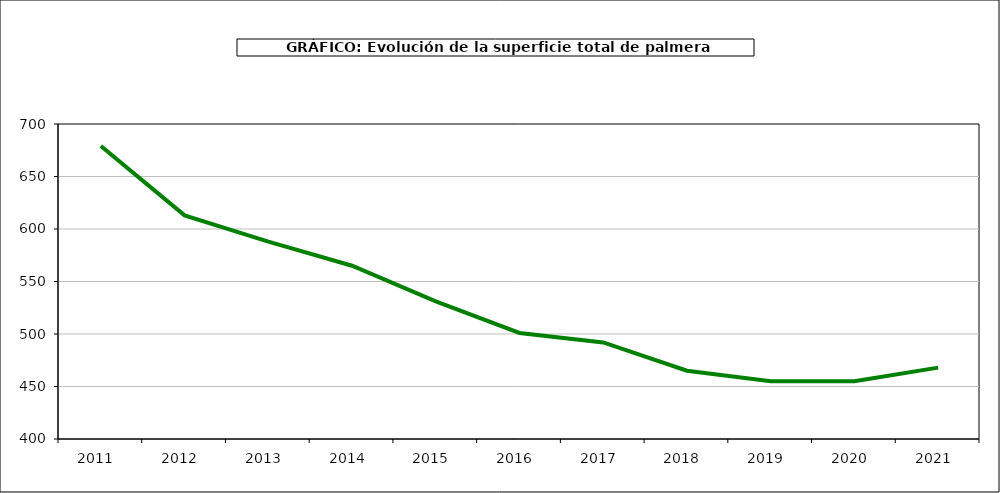
| Category | superficie kiwi |
|---|---|
| 2011.0 | 679 |
| 2012.0 | 613 |
| 2013.0 | 588 |
| 2014.0 | 565 |
| 2015.0 | 531 |
| 2016.0 | 501 |
| 2017.0 | 492 |
| 2018.0 | 465 |
| 2019.0 | 455 |
| 2020.0 | 455 |
| 2021.0 | 468 |